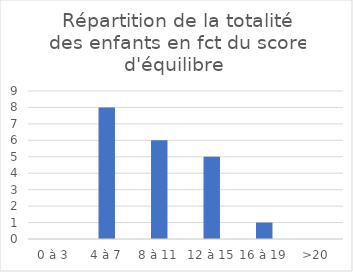
| Category | Series 0 |
|---|---|
| 0 à 3 | 0 |
| 4 à 7 | 8 |
| 8 à 11 | 6 |
| 12 à 15 | 5 |
| 16 à 19 | 1 |
| >20 | 0 |